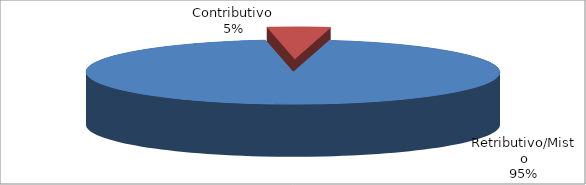
| Category | Series 1 |
|---|---|
| Retributivo/Misto | 66893 |
| Contributivo | 3455 |